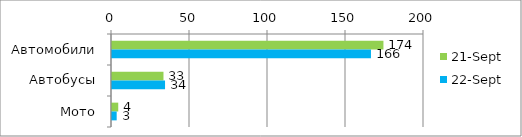
| Category | 21.сен | 22.сен |
|---|---|---|
| Автомобили | 174 | 166 |
| Автобусы | 33 | 34 |
| Мото | 4 | 3 |